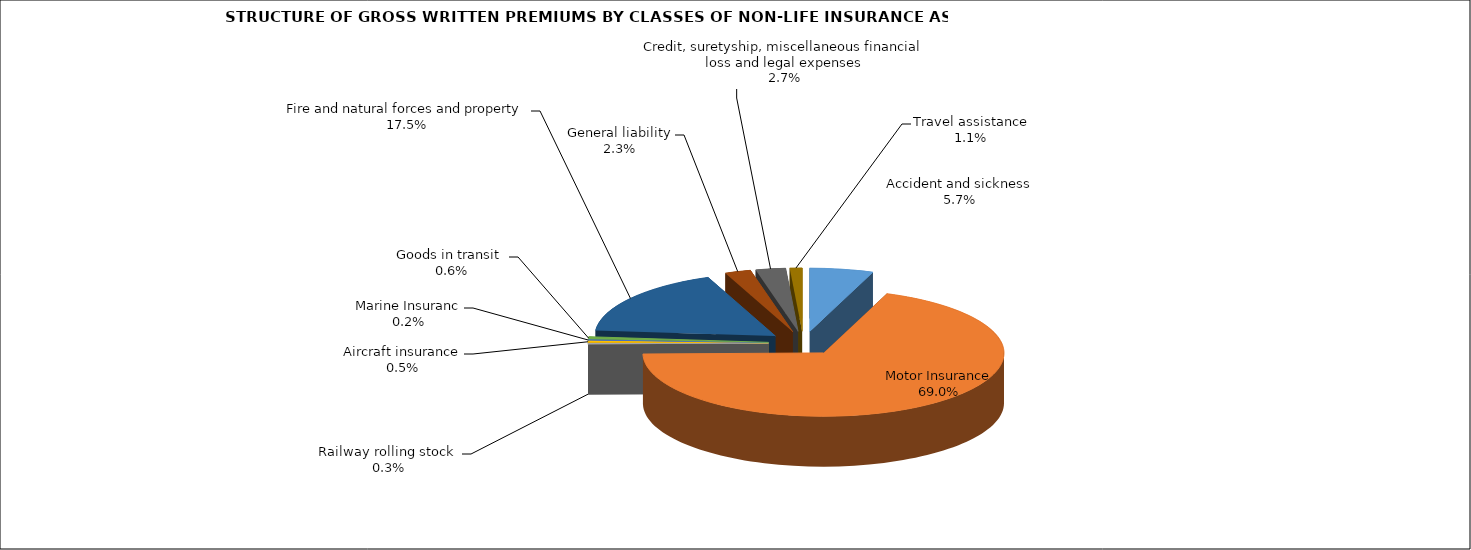
| Category | Accident and sickness |
|---|---|
| Accident and sickness | 0.057 |
| Motor Insurance | 0.69 |
| Railway rolling stock  | 0.003 |
| Aircraft insurance | 0.005 |
| Marine Insuranc | 0.002 |
| Goods in transit  | 0.006 |
| Fire and natural forces and property | 0.175 |
| General liability | 0.023 |
| Credit, suretyship, miscellaneous financial loss and legal expenses | 0.027 |
| Travel assistance | 0.011 |